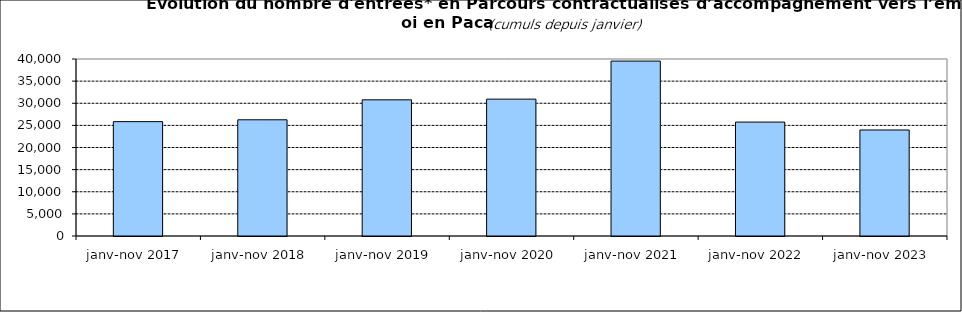
| Category | Series 1 |
|---|---|
| janv-nov 2017  | 25847 |
| janv-nov 2018  | 26264 |
| janv-nov 2019  | 30774 |
| janv-nov 2020  | 30930 |
| janv-nov 2021  | 39529 |
| janv-nov 2022  | 25743 |
| janv-nov 2023  | 23956 |